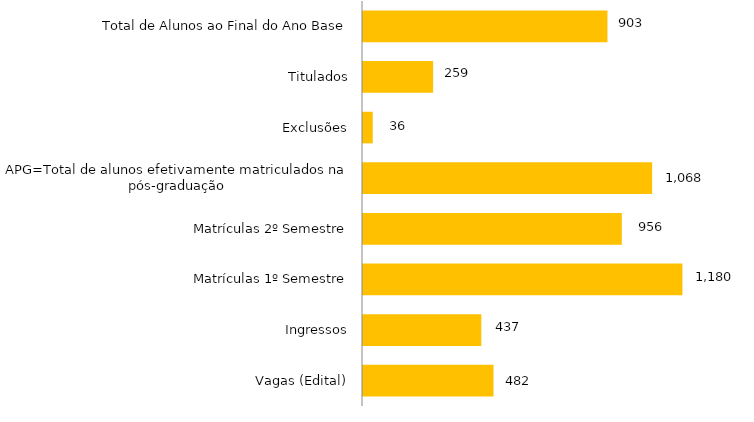
| Category | Curso |
|---|---|
| Vagas (Edital) | 482 |
| Ingressos | 437 |
| Matrículas 1º Semestre | 1180 |
| Matrículas 2º Semestre | 956 |
| APG=Total de alunos efetivamente matriculados na pós-graduação | 1068 |
| Exclusões | 36 |
| Titulados | 259 |
| Total de Alunos ao Final do Ano Base | 903 |